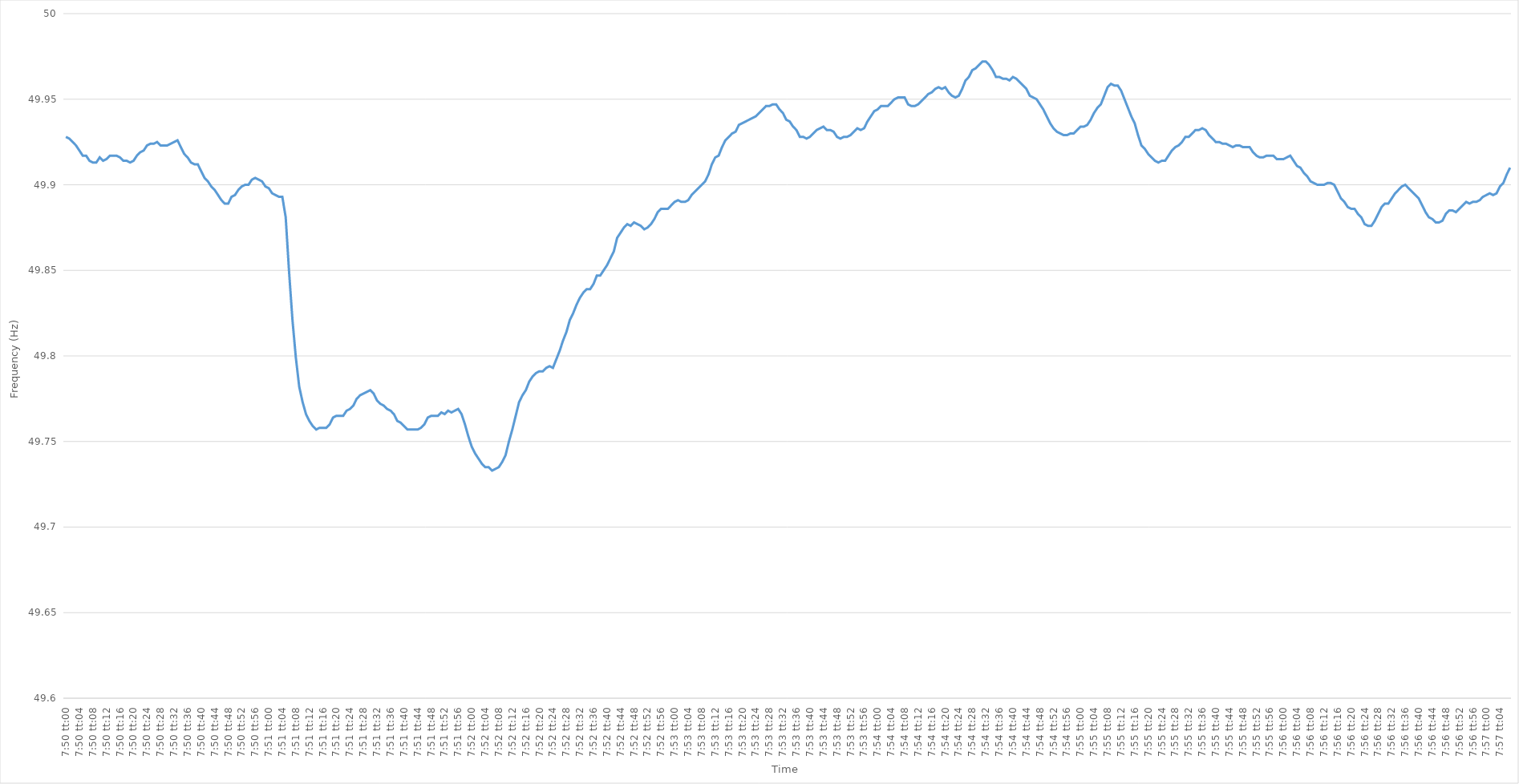
| Category | Series 0 |
|---|---|
| 0.3263888888888889 | 49.928 |
| 0.32640046296296293 | 49.927 |
| 0.32641203703703703 | 49.925 |
| 0.3264236111111111 | 49.923 |
| 0.32643518518518516 | 49.92 |
| 0.32644675925925926 | 49.917 |
| 0.32645833333333335 | 49.917 |
| 0.3264699074074074 | 49.914 |
| 0.3264814814814815 | 49.913 |
| 0.3264930555555556 | 49.913 |
| 0.3265046296296296 | 49.916 |
| 0.3265162037037037 | 49.914 |
| 0.3265277777777778 | 49.915 |
| 0.32653935185185184 | 49.917 |
| 0.32655092592592594 | 49.917 |
| 0.32656250000000003 | 49.917 |
| 0.32657407407407407 | 49.916 |
| 0.32658564814814817 | 49.914 |
| 0.3265972222222222 | 49.914 |
| 0.3266087962962963 | 49.913 |
| 0.32662037037037034 | 49.914 |
| 0.32663194444444443 | 49.917 |
| 0.3266435185185185 | 49.919 |
| 0.32665509259259257 | 49.92 |
| 0.32666666666666666 | 49.923 |
| 0.32667824074074076 | 49.924 |
| 0.3266898148148148 | 49.924 |
| 0.3267013888888889 | 49.925 |
| 0.326712962962963 | 49.923 |
| 0.326724537037037 | 49.923 |
| 0.3267361111111111 | 49.923 |
| 0.3267476851851852 | 49.924 |
| 0.32675925925925925 | 49.925 |
| 0.32677083333333334 | 49.926 |
| 0.32678240740740744 | 49.922 |
| 0.3267939814814815 | 49.918 |
| 0.32680555555555557 | 49.916 |
| 0.3268171296296296 | 49.913 |
| 0.3268287037037037 | 49.912 |
| 0.32684027777777774 | 49.912 |
| 0.32685185185185184 | 49.908 |
| 0.32686342592592593 | 49.904 |
| 0.32687499999999997 | 49.902 |
| 0.32688657407407407 | 49.899 |
| 0.32689814814814816 | 49.897 |
| 0.3269097222222222 | 49.894 |
| 0.3269212962962963 | 49.891 |
| 0.3269328703703704 | 49.889 |
| 0.3269444444444444 | 49.889 |
| 0.3269560185185185 | 49.893 |
| 0.3269675925925926 | 49.894 |
| 0.32697916666666665 | 49.897 |
| 0.32699074074074075 | 49.899 |
| 0.32700231481481484 | 49.9 |
| 0.3270138888888889 | 49.9 |
| 0.327025462962963 | 49.903 |
| 0.327037037037037 | 49.904 |
| 0.3270486111111111 | 49.903 |
| 0.32706018518518515 | 49.902 |
| 0.3270717592592593 | 49.899 |
| 0.32708333333333334 | 49.898 |
| 0.3270949074074074 | 49.895 |
| 0.32710648148148147 | 49.894 |
| 0.32711805555555556 | 49.893 |
| 0.3271296296296296 | 49.893 |
| 0.3271412037037037 | 49.881 |
| 0.3271527777777778 | 49.849 |
| 0.32716435185185183 | 49.821 |
| 0.3271759259259259 | 49.799 |
| 0.3271875 | 49.782 |
| 0.32719907407407406 | 49.773 |
| 0.32721064814814815 | 49.766 |
| 0.32722222222222225 | 49.762 |
| 0.3272337962962963 | 49.759 |
| 0.3272453703703704 | 49.757 |
| 0.3272569444444445 | 49.758 |
| 0.3272685185185185 | 49.758 |
| 0.32728009259259255 | 49.758 |
| 0.3272916666666667 | 49.76 |
| 0.32730324074074074 | 49.764 |
| 0.32731481481481484 | 49.765 |
| 0.3273263888888889 | 49.765 |
| 0.32733796296296297 | 49.765 |
| 0.327349537037037 | 49.768 |
| 0.3273611111111111 | 49.769 |
| 0.3273726851851852 | 49.771 |
| 0.32738425925925924 | 49.775 |
| 0.32739583333333333 | 49.777 |
| 0.3274074074074074 | 49.778 |
| 0.32741898148148146 | 49.779 |
| 0.32743055555555556 | 49.78 |
| 0.32744212962962965 | 49.778 |
| 0.3274537037037037 | 49.774 |
| 0.3274652777777778 | 49.772 |
| 0.3274768518518519 | 49.771 |
| 0.3274884259259259 | 49.769 |
| 0.3275 | 49.768 |
| 0.3275115740740741 | 49.766 |
| 0.32752314814814815 | 49.762 |
| 0.32753472222222224 | 49.761 |
| 0.3275462962962963 | 49.759 |
| 0.3275578703703704 | 49.757 |
| 0.3275694444444444 | 49.757 |
| 0.3275810185185185 | 49.757 |
| 0.3275925925925926 | 49.757 |
| 0.32760416666666664 | 49.758 |
| 0.32761574074074074 | 49.76 |
| 0.32762731481481483 | 49.764 |
| 0.32763888888888887 | 49.765 |
| 0.32765046296296296 | 49.765 |
| 0.32766203703703706 | 49.765 |
| 0.3276736111111111 | 49.767 |
| 0.3276851851851852 | 49.766 |
| 0.3276967592592593 | 49.768 |
| 0.3277083333333333 | 49.767 |
| 0.3277199074074074 | 49.768 |
| 0.3277314814814815 | 49.769 |
| 0.32774305555555555 | 49.766 |
| 0.32775462962962965 | 49.76 |
| 0.3277662037037037 | 49.753 |
| 0.3277777777777778 | 49.747 |
| 0.3277893518518518 | 49.743 |
| 0.3278009259259259 | 49.74 |
| 0.3278125 | 49.737 |
| 0.32782407407407405 | 49.735 |
| 0.32783564814814814 | 49.735 |
| 0.32784722222222223 | 49.733 |
| 0.3278587962962963 | 49.734 |
| 0.32787037037037037 | 49.735 |
| 0.32788194444444446 | 49.738 |
| 0.3278935185185185 | 49.742 |
| 0.3279050925925926 | 49.75 |
| 0.3279166666666667 | 49.757 |
| 0.32792824074074073 | 49.765 |
| 0.3279398148148148 | 49.773 |
| 0.3279513888888889 | 49.777 |
| 0.32796296296296296 | 49.78 |
| 0.32797453703703705 | 49.785 |
| 0.3279861111111111 | 49.788 |
| 0.3279976851851852 | 49.79 |
| 0.3280092592592592 | 49.791 |
| 0.3280208333333334 | 49.791 |
| 0.3280324074074074 | 49.793 |
| 0.32804398148148145 | 49.794 |
| 0.32805555555555554 | 49.793 |
| 0.32806712962962964 | 49.798 |
| 0.3280787037037037 | 49.803 |
| 0.3280902777777778 | 49.809 |
| 0.32810185185185187 | 49.814 |
| 0.3281134259259259 | 49.821 |
| 0.328125 | 49.825 |
| 0.3281365740740741 | 49.83 |
| 0.32814814814814813 | 49.834 |
| 0.3281597222222222 | 49.837 |
| 0.3281712962962963 | 49.839 |
| 0.32818287037037036 | 49.839 |
| 0.32819444444444446 | 49.842 |
| 0.32820601851851855 | 49.847 |
| 0.3282175925925926 | 49.847 |
| 0.3282291666666666 | 49.85 |
| 0.3282407407407408 | 49.853 |
| 0.3282523148148148 | 49.857 |
| 0.3282638888888889 | 49.861 |
| 0.32827546296296295 | 49.869 |
| 0.32828703703703704 | 49.872 |
| 0.3282986111111111 | 49.875 |
| 0.3283101851851852 | 49.877 |
| 0.32832175925925927 | 49.876 |
| 0.3283333333333333 | 49.878 |
| 0.3283449074074074 | 49.877 |
| 0.3283564814814815 | 49.876 |
| 0.32836805555555554 | 49.874 |
| 0.32837962962962963 | 49.875 |
| 0.3283912037037037 | 49.877 |
| 0.32840277777777777 | 49.88 |
| 0.32841435185185186 | 49.884 |
| 0.32842592592592595 | 49.886 |
| 0.3284375 | 49.886 |
| 0.3284490740740741 | 49.886 |
| 0.3284606481481482 | 49.888 |
| 0.3284722222222222 | 49.89 |
| 0.3284837962962963 | 49.891 |
| 0.32849537037037035 | 49.89 |
| 0.32850694444444445 | 49.89 |
| 0.3285185185185185 | 49.891 |
| 0.3285300925925926 | 49.894 |
| 0.3285416666666667 | 49.896 |
| 0.3285532407407407 | 49.898 |
| 0.3285648148148148 | 49.9 |
| 0.3285763888888889 | 49.902 |
| 0.32858796296296294 | 49.906 |
| 0.32859953703703704 | 49.912 |
| 0.32861111111111113 | 49.916 |
| 0.32862268518518517 | 49.917 |
| 0.32863425925925926 | 49.922 |
| 0.32864583333333336 | 49.926 |
| 0.3286574074074074 | 49.928 |
| 0.3286689814814815 | 49.93 |
| 0.3286805555555556 | 49.931 |
| 0.3286921296296296 | 49.935 |
| 0.3287037037037037 | 49.936 |
| 0.32871527777777776 | 49.937 |
| 0.32872685185185185 | 49.938 |
| 0.3287384259259259 | 49.939 |
| 0.32875 | 49.94 |
| 0.3287615740740741 | 49.942 |
| 0.3287731481481481 | 49.944 |
| 0.3287847222222222 | 49.946 |
| 0.3287962962962963 | 49.946 |
| 0.32880787037037035 | 49.947 |
| 0.32881944444444444 | 49.947 |
| 0.32883101851851854 | 49.944 |
| 0.3288425925925926 | 49.942 |
| 0.32885416666666667 | 49.938 |
| 0.32886574074074076 | 49.937 |
| 0.3288773148148148 | 49.934 |
| 0.3288888888888889 | 49.932 |
| 0.328900462962963 | 49.928 |
| 0.32891203703703703 | 49.928 |
| 0.3289236111111111 | 49.927 |
| 0.32893518518518516 | 49.928 |
| 0.32894675925925926 | 49.93 |
| 0.3289583333333333 | 49.932 |
| 0.32896990740740745 | 49.933 |
| 0.3289814814814815 | 49.934 |
| 0.3289930555555555 | 49.932 |
| 0.3290046296296296 | 49.932 |
| 0.3290162037037037 | 49.931 |
| 0.32902777777777775 | 49.928 |
| 0.32903935185185185 | 49.927 |
| 0.32905092592592594 | 49.928 |
| 0.3290625 | 49.928 |
| 0.3290740740740741 | 49.929 |
| 0.32908564814814817 | 49.931 |
| 0.3290972222222222 | 49.933 |
| 0.3291087962962963 | 49.932 |
| 0.3291203703703704 | 49.933 |
| 0.32913194444444444 | 49.937 |
| 0.32914351851851853 | 49.94 |
| 0.3291550925925926 | 49.943 |
| 0.32916666666666666 | 49.944 |
| 0.3291782407407407 | 49.946 |
| 0.32918981481481485 | 49.946 |
| 0.3292013888888889 | 49.946 |
| 0.329212962962963 | 49.948 |
| 0.329224537037037 | 49.95 |
| 0.3292361111111111 | 49.951 |
| 0.32924768518518516 | 49.951 |
| 0.32925925925925925 | 49.951 |
| 0.32927083333333335 | 49.947 |
| 0.3292824074074074 | 49.946 |
| 0.3292939814814815 | 49.946 |
| 0.3293055555555556 | 49.947 |
| 0.3293171296296296 | 49.949 |
| 0.3293287037037037 | 49.951 |
| 0.3293402777777778 | 49.953 |
| 0.32935185185185184 | 49.954 |
| 0.32936342592592593 | 49.956 |
| 0.32937500000000003 | 49.957 |
| 0.32938657407407407 | 49.956 |
| 0.32939814814814816 | 49.957 |
| 0.32940972222222226 | 49.954 |
| 0.3294212962962963 | 49.952 |
| 0.3294328703703704 | 49.951 |
| 0.32944444444444443 | 49.952 |
| 0.3294560185185185 | 49.956 |
| 0.32946759259259256 | 49.961 |
| 0.32947916666666666 | 49.963 |
| 0.32949074074074075 | 49.967 |
| 0.3295023148148148 | 49.968 |
| 0.3295138888888889 | 49.97 |
| 0.329525462962963 | 49.972 |
| 0.329537037037037 | 49.972 |
| 0.3295486111111111 | 49.97 |
| 0.3295601851851852 | 49.967 |
| 0.32957175925925924 | 49.963 |
| 0.32958333333333334 | 49.963 |
| 0.32959490740740743 | 49.962 |
| 0.3296064814814815 | 49.962 |
| 0.32961805555555557 | 49.961 |
| 0.32962962962962966 | 49.963 |
| 0.3296412037037037 | 49.962 |
| 0.3296527777777778 | 49.96 |
| 0.32966435185185183 | 49.958 |
| 0.32967592592592593 | 49.956 |
| 0.32968749999999997 | 49.952 |
| 0.32969907407407406 | 49.951 |
| 0.32971064814814816 | 49.95 |
| 0.3297222222222222 | 49.947 |
| 0.3297337962962963 | 49.944 |
| 0.3297453703703704 | 49.94 |
| 0.3297569444444444 | 49.936 |
| 0.3297685185185185 | 49.933 |
| 0.3297800925925926 | 49.931 |
| 0.32979166666666665 | 49.93 |
| 0.32980324074074074 | 49.929 |
| 0.32981481481481484 | 49.929 |
| 0.3298263888888889 | 49.93 |
| 0.32983796296296297 | 49.93 |
| 0.32984953703703707 | 49.932 |
| 0.3298611111111111 | 49.934 |
| 0.3298726851851852 | 49.934 |
| 0.32988425925925924 | 49.935 |
| 0.32989583333333333 | 49.938 |
| 0.32990740740740737 | 49.942 |
| 0.3299189814814815 | 49.945 |
| 0.32993055555555556 | 49.947 |
| 0.3299421296296296 | 49.952 |
| 0.3299537037037037 | 49.957 |
| 0.3299652777777778 | 49.959 |
| 0.3299768518518518 | 49.958 |
| 0.3299884259259259 | 49.958 |
| 0.33 | 49.955 |
| 0.33001157407407405 | 49.95 |
| 0.33002314814814815 | 49.945 |
| 0.33003472222222224 | 49.94 |
| 0.3300462962962963 | 49.936 |
| 0.3300578703703704 | 49.929 |
| 0.33006944444444447 | 49.923 |
| 0.3300810185185185 | 49.921 |
| 0.3300925925925926 | 49.918 |
| 0.3301041666666667 | 49.916 |
| 0.33011574074074074 | 49.914 |
| 0.3301273148148148 | 49.913 |
| 0.3301388888888889 | 49.914 |
| 0.33015046296296297 | 49.914 |
| 0.330162037037037 | 49.917 |
| 0.3301736111111111 | 49.92 |
| 0.3301851851851852 | 49.922 |
| 0.33019675925925923 | 49.923 |
| 0.3302083333333333 | 49.925 |
| 0.3302199074074074 | 49.928 |
| 0.33023148148148146 | 49.928 |
| 0.33024305555555555 | 49.93 |
| 0.33025462962962965 | 49.932 |
| 0.3302662037037037 | 49.932 |
| 0.3302777777777778 | 49.933 |
| 0.3302893518518519 | 49.932 |
| 0.3303009259259259 | 49.929 |
| 0.3303125 | 49.927 |
| 0.3303240740740741 | 49.925 |
| 0.33033564814814814 | 49.925 |
| 0.33034722222222224 | 49.924 |
| 0.33035879629629633 | 49.924 |
| 0.33037037037037037 | 49.923 |
| 0.33038194444444446 | 49.922 |
| 0.3303935185185185 | 49.923 |
| 0.3304050925925926 | 49.923 |
| 0.33041666666666664 | 49.922 |
| 0.33042824074074073 | 49.922 |
| 0.3304398148148148 | 49.922 |
| 0.33045138888888886 | 49.919 |
| 0.33046296296296296 | 49.917 |
| 0.33047453703703705 | 49.916 |
| 0.3304861111111111 | 49.916 |
| 0.3304976851851852 | 49.917 |
| 0.3305092592592593 | 49.917 |
| 0.3305208333333333 | 49.917 |
| 0.3305324074074074 | 49.915 |
| 0.3305439814814815 | 49.915 |
| 0.33055555555555555 | 49.915 |
| 0.33056712962962964 | 49.916 |
| 0.33057870370370374 | 49.917 |
| 0.3305902777777778 | 49.914 |
| 0.33060185185185187 | 49.911 |
| 0.3306134259259259 | 49.91 |
| 0.330625 | 49.907 |
| 0.33063657407407404 | 49.905 |
| 0.33064814814814814 | 49.902 |
| 0.33065972222222223 | 49.901 |
| 0.33067129629629627 | 49.9 |
| 0.33068287037037036 | 49.9 |
| 0.33069444444444446 | 49.9 |
| 0.3307060185185185 | 49.901 |
| 0.3307175925925926 | 49.901 |
| 0.3307291666666667 | 49.9 |
| 0.3307407407407407 | 49.896 |
| 0.3307523148148148 | 49.892 |
| 0.3307638888888889 | 49.89 |
| 0.33077546296296295 | 49.887 |
| 0.33078703703703705 | 49.886 |
| 0.33079861111111114 | 49.886 |
| 0.3308101851851852 | 49.883 |
| 0.3308217592592593 | 49.881 |
| 0.3308333333333333 | 49.877 |
| 0.3308449074074074 | 49.876 |
| 0.33085648148148145 | 49.876 |
| 0.3308680555555556 | 49.879 |
| 0.33087962962962963 | 49.883 |
| 0.3308912037037037 | 49.887 |
| 0.33090277777777777 | 49.889 |
| 0.33091435185185186 | 49.889 |
| 0.3309259259259259 | 49.892 |
| 0.3309375 | 49.895 |
| 0.3309490740740741 | 49.897 |
| 0.33096064814814813 | 49.899 |
| 0.3309722222222222 | 49.9 |
| 0.3309837962962963 | 49.898 |
| 0.33099537037037036 | 49.896 |
| 0.33100694444444445 | 49.894 |
| 0.33101851851851855 | 49.892 |
| 0.3310300925925926 | 49.888 |
| 0.3310416666666667 | 49.884 |
| 0.3310532407407408 | 49.881 |
| 0.3310648148148148 | 49.88 |
| 0.33107638888888885 | 49.878 |
| 0.331087962962963 | 49.878 |
| 0.33109953703703704 | 49.879 |
| 0.3311111111111111 | 49.883 |
| 0.3311226851851852 | 49.885 |
| 0.33113425925925927 | 49.885 |
| 0.3311458333333333 | 49.884 |
| 0.3311574074074074 | 49.886 |
| 0.3311689814814815 | 49.888 |
| 0.33118055555555553 | 49.89 |
| 0.33119212962962963 | 49.889 |
| 0.3312037037037037 | 49.89 |
| 0.33121527777777776 | 49.89 |
| 0.33122685185185186 | 49.891 |
| 0.33123842592592595 | 49.893 |
| 0.33125 | 49.894 |
| 0.3312615740740741 | 49.895 |
| 0.3312731481481482 | 49.894 |
| 0.3312847222222222 | 49.895 |
| 0.3312962962962963 | 49.899 |
| 0.3313078703703704 | 49.901 |
| 0.33131944444444444 | 49.906 |
| 0.33133101851851854 | 49.91 |